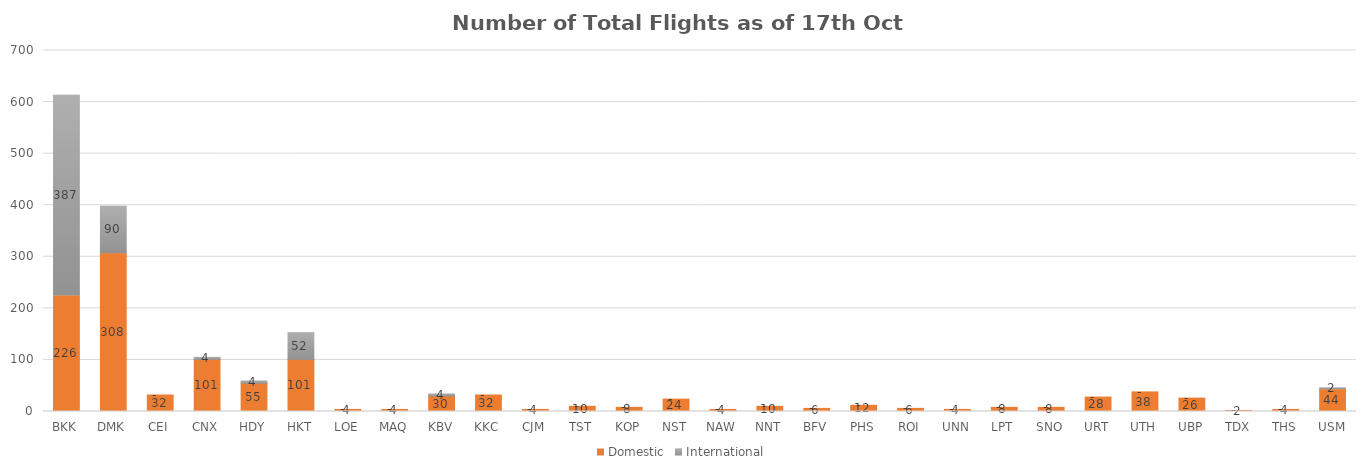
| Category | Domestic | International |
|---|---|---|
| BKK | 226 | 387 |
| DMK | 308 | 90 |
| CEI | 32 | 0 |
| CNX | 101 | 4 |
| HDY | 55 | 4 |
| HKT | 101 | 52 |
| LOE | 4 | 0 |
| MAQ | 4 | 0 |
| KBV | 30 | 4 |
| KKC | 32 | 0 |
| CJM | 4 | 0 |
| TST | 10 | 0 |
| KOP | 8 | 0 |
| NST | 24 | 0 |
| NAW | 4 | 0 |
| NNT | 10 | 0 |
| BFV | 6 | 0 |
| PHS | 12 | 0 |
| ROI | 6 | 0 |
| UNN | 4 | 0 |
| LPT | 8 | 0 |
| SNO | 8 | 0 |
| URT | 28 | 0 |
| UTH | 38 | 0 |
| UBP | 26 | 0 |
| TDX | 2 | 0 |
| THS | 4 | 0 |
| USM | 44 | 2 |